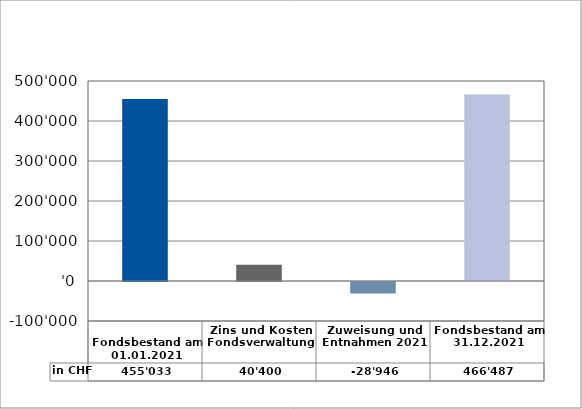
| Category | in CHF |
|---|---|
| 
Fondsbestand am 01.01.2021

 | 455033 |
| Zins und Kosten Fondsverwaltung | 40400 |
| Zuweisung und Entnahmen 2021 | -28946 |
| Fondsbestand am 31.12.2021 | 466487 |